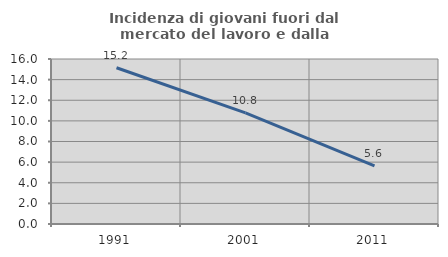
| Category | Incidenza di giovani fuori dal mercato del lavoro e dalla formazione  |
|---|---|
| 1991.0 | 15.152 |
| 2001.0 | 10.769 |
| 2011.0 | 5.634 |